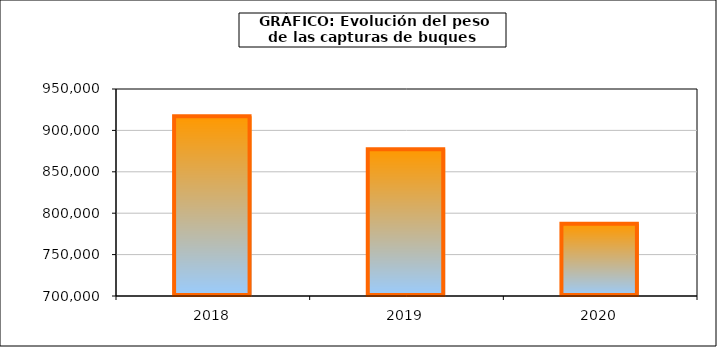
| Category | Series1 |
|---|---|
| 2018.0 | 917012.01 |
| 2019.0 | 877211.749 |
| 2020.0 | 787257.944 |